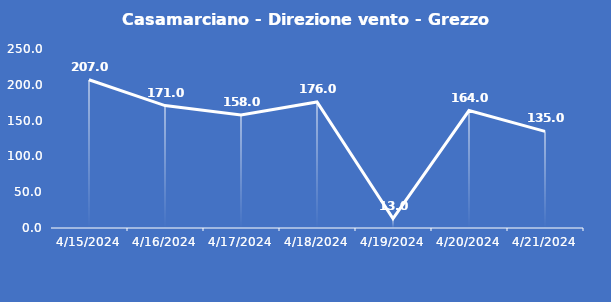
| Category | Casamarciano - Direzione vento - Grezzo (°N) |
|---|---|
| 4/15/24 | 207 |
| 4/16/24 | 171 |
| 4/17/24 | 158 |
| 4/18/24 | 176 |
| 4/19/24 | 13 |
| 4/20/24 | 164 |
| 4/21/24 | 135 |